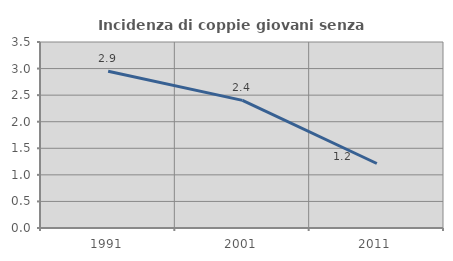
| Category | Incidenza di coppie giovani senza figli |
|---|---|
| 1991.0 | 2.948 |
| 2001.0 | 2.401 |
| 2011.0 | 1.214 |